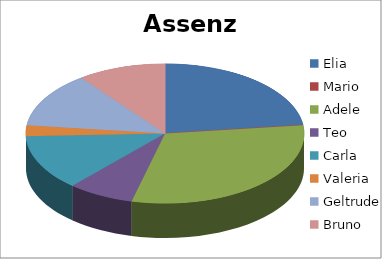
| Category | Assenze |
|---|---|
| Elia | 9 |
| Mario | 0 |
| Adele | 12 |
| Teo | 3 |
| Carla | 5 |
| Valeria | 1 |
| Geltrude | 5 |
| Bruno | 4 |